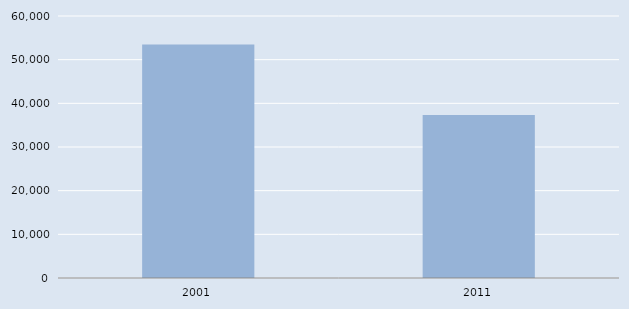
| Category | Series 0 |
|---|---|
| 2001.0 | 53477 |
| 2011.0 | 37326 |